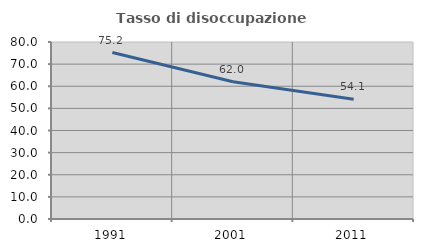
| Category | Tasso di disoccupazione giovanile  |
|---|---|
| 1991.0 | 75.217 |
| 2001.0 | 62.009 |
| 2011.0 | 54.128 |